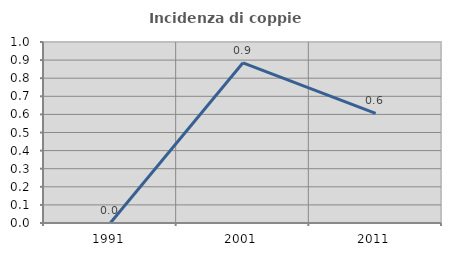
| Category | Incidenza di coppie miste |
|---|---|
| 1991.0 | 0 |
| 2001.0 | 0.885 |
| 2011.0 | 0.606 |